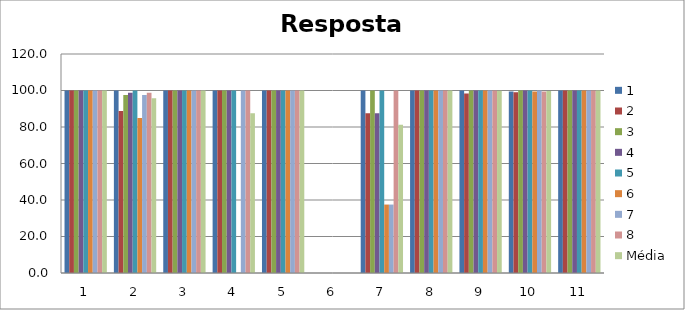
| Category | 1 | 2 | 3 | 4 | 5 | 6 | 7 | 8 | Média |
|---|---|---|---|---|---|---|---|---|---|
| 0 | 100 | 100 | 100 | 100 | 100 | 100 | 100 | 100 | 100 |
| 1 | 100 | 88.75 | 97.5 | 98.75 | 100 | 85 | 97.5 | 98.75 | 95.781 |
| 2 | 100 | 100 | 100 | 100 | 100 | 100 | 100 | 100 | 100 |
| 3 | 100 | 100 | 100 | 100 | 100 | 0 | 100 | 100 | 87.5 |
| 4 | 100 | 100 | 100 | 100 | 100 | 100 | 100 | 100 | 100 |
| 5 | 0 | 0 | 0 | 0 | 0 | 0 | 0 | 0 | 0 |
| 6 | 100 | 87.5 | 100 | 87.5 | 100 | 37.5 | 37.5 | 100 | 81.25 |
| 7 | 100 | 100 | 100 | 100 | 100 | 100 | 100 | 100 | 100 |
| 8 | 100 | 98.39 | 100 | 100 | 100 | 100 | 100 | 100 | 99.799 |
| 9 | 99.49 | 98.99 | 100 | 100 | 100 | 99.49 | 100 | 99.49 | 99.682 |
| 10 | 100 | 100 | 100 | 100 | 100 | 100 | 100 | 100 | 100 |